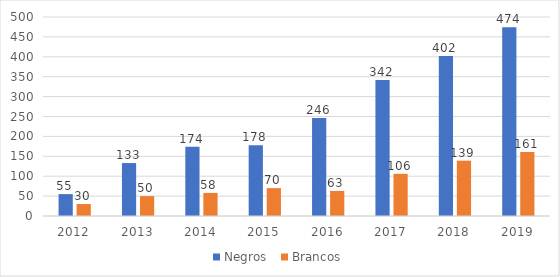
| Category | Negros  | Brancos |
|---|---|---|
| 2012 | 55 | 30 |
| 2013 | 133 | 50 |
| 2014 | 174 | 58 |
| 2015 | 178 | 70 |
| 2016 | 246 | 63 |
| 2017 | 342 | 106 |
| 2018 | 402 | 139 |
| 2019 | 474 | 161 |